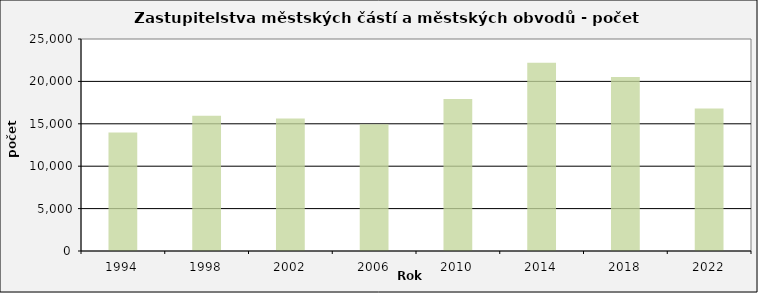
| Category | Počet kandidátů |
|---|---|
| 1994.0 | 13967 |
| 1998.0 | 15945 |
| 2002.0 | 15621 |
| 2006.0 | 14950 |
| 2010.0 | 17923 |
| 2014.0 | 22197 |
| 2018.0 | 20531 |
| 2022.0 | 16791 |